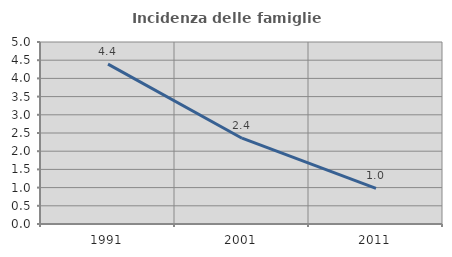
| Category | Incidenza delle famiglie numerose |
|---|---|
| 1991.0 | 4.391 |
| 2001.0 | 2.357 |
| 2011.0 | 0.98 |